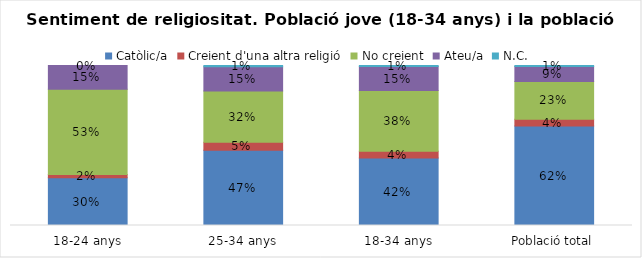
| Category | Catòlic/a | Creient d'una altra religió | No creient | Ateu/a | N.C. |
|---|---|---|---|---|---|
| 18-24 anys | 0.298 | 0.021 | 0.532 | 0.149 | 0 |
| 25-34 anys | 0.471 | 0.05 | 0.319 | 0.151 | 0.008 |
| 18-34 anys | 0.422 | 0.042 | 0.38 | 0.151 | 0.006 |
| Població total | 0.622 | 0.042 | 0.235 | 0.094 | 0.007 |